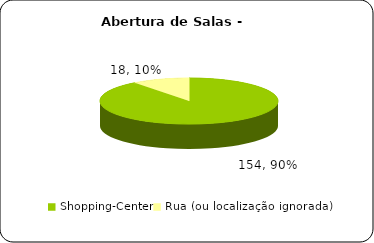
| Category | Abertura |
|---|---|
| Shopping-Center | 154 |
| Rua (ou localização ignorada) | 18 |